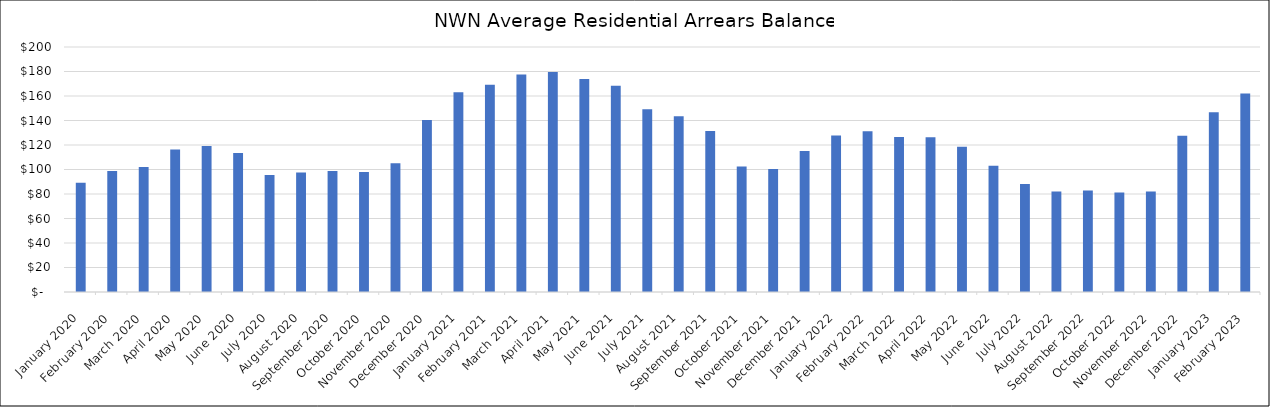
| Category | Average Arrears Balance |
|---|---|
| 2020-01-01 | 89.091 |
| 2020-02-01 | 98.732 |
| 2020-03-01 | 102.115 |
| 2020-04-01 | 116.41 |
| 2020-05-01 | 119.158 |
| 2020-06-01 | 113.444 |
| 2020-07-01 | 95.581 |
| 2020-08-01 | 97.577 |
| 2020-09-01 | 98.796 |
| 2020-10-01 | 97.876 |
| 2020-11-01 | 105.185 |
| 2020-12-01 | 140.367 |
| 2021-01-01 | 163.01 |
| 2021-02-01 | 169.198 |
| 2021-03-01 | 177.539 |
| 2021-04-01 | 179.604 |
| 2021-05-01 | 173.792 |
| 2021-06-01 | 168.295 |
| 2021-07-01 | 149.144 |
| 2021-08-01 | 143.465 |
| 2021-09-01 | 131.525 |
| 2021-10-01 | 102.459 |
| 2021-11-01 | 100.361 |
| 2021-12-01 | 115.196 |
| 2022-01-01 | 127.667 |
| 2022-02-01 | 131.243 |
| 2022-03-01 | 126.564 |
| 2022-04-01 | 126.24 |
| 2022-05-01 | 118.483 |
| 2022-06-01 | 102.96 |
| 2022-07-01 | 88.133 |
| 2022-08-01 | 81.94 |
| 2022-09-01 | 82.932 |
| 2022-10-01 | 81.148 |
| 2022-11-01 | 81.966 |
| 2022-12-01 | 127.614 |
| 2023-01-01 | 146.78 |
| 2023-02-01 | 162 |